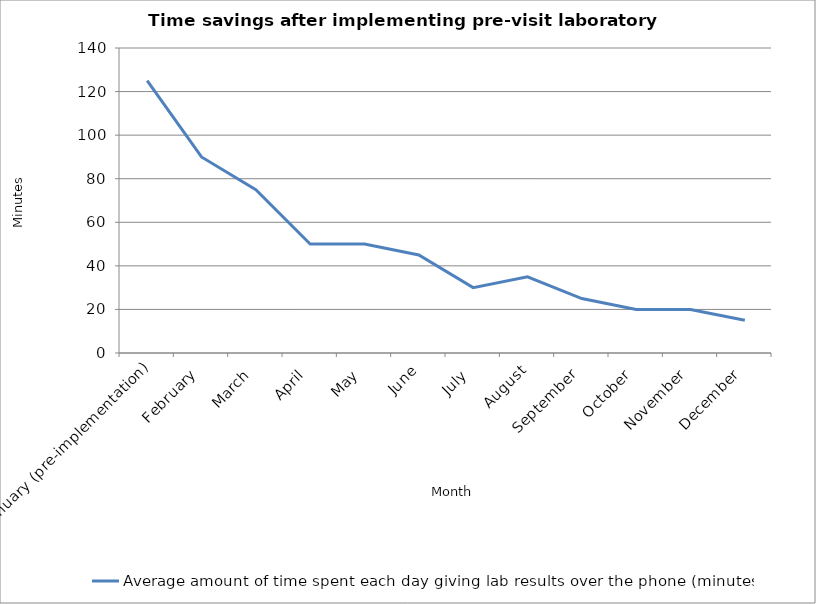
| Category | Average amount of time spent each day giving lab results over the phone (minutes) |
|---|---|
| January (pre-implementation) | 125 |
| February | 90 |
| March | 75 |
| April | 50 |
| May | 50 |
| June | 45 |
| July | 30 |
| August | 35 |
| September | 25 |
| October | 20 |
| November | 20 |
| December | 15 |